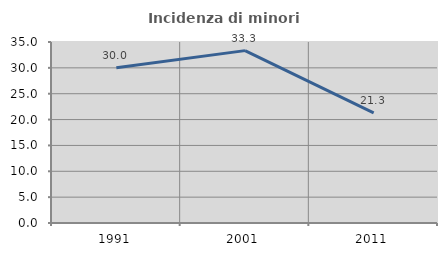
| Category | Incidenza di minori stranieri |
|---|---|
| 1991.0 | 30 |
| 2001.0 | 33.333 |
| 2011.0 | 21.277 |